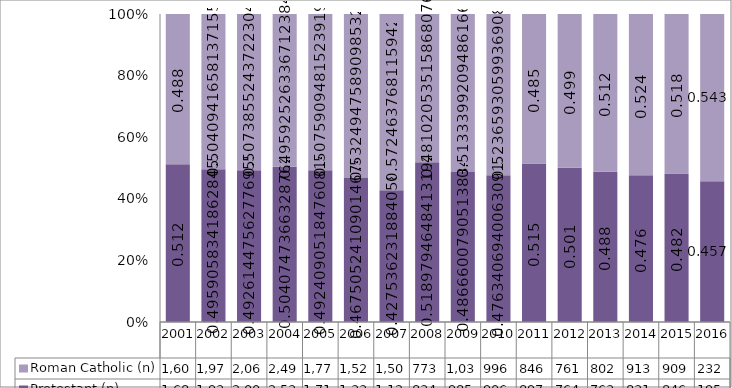
| Category | Protestant (n) | Roman Catholic (n) |
|---|---|---|
| 2001.0 | 1688 | 1607 |
| 2002.0 | 1938 | 1970 |
| 2003.0 | 2001 | 2061 |
| 2004.0 | 2536 | 2495 |
| 2005.0 | 1719 | 1772 |
| 2006.0 | 1338 | 1524 |
| 2007.0 | 1121 | 1501 |
| 2008.0 | 834 | 773 |
| 2009.0 | 985 | 1039 |
| 2010.0 | 906 | 996 |
| 2011.0 | 897 | 846 |
| 2012.0 | 764 | 761 |
| 2013.0 | 763 | 802 |
| 2014.0 | 831 | 913 |
| 2015.0 | 846 | 909 |
| 2016.0 | 195 | 232 |